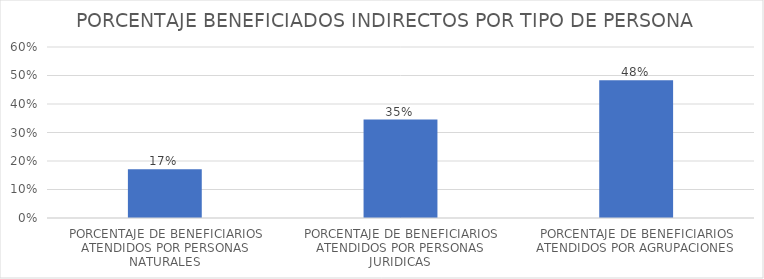
| Category | % |
|---|---|
| PORCENTAJE DE BENEFICIARIOS ATENDIDOS POR PERSONAS NATURALES | 0.171 |
| PORCENTAJE DE BENEFICIARIOS ATENDIDOS POR PERSONAS JURIDICAS | 0.345 |
| PORCENTAJE DE BENEFICIARIOS ATENDIDOS POR AGRUPACIONES | 0.483 |